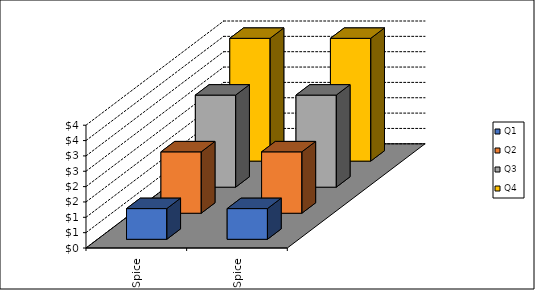
| Category | Q1 | Q2 | Q3 | Q4 |
|---|---|---|---|---|
| Spice | 1 | 2 | 3 | 4 |
| Spice | 1 | 2 | 3 | 4 |